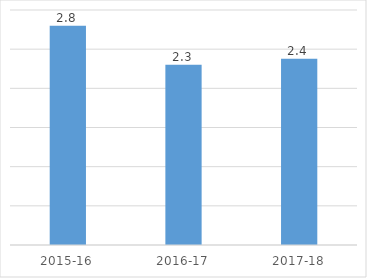
| Category | Series 0 |
|---|---|
| 2015-16 | 2.8 |
| 2016-17 | 2.3 |
| 2017-18 | 2.378 |